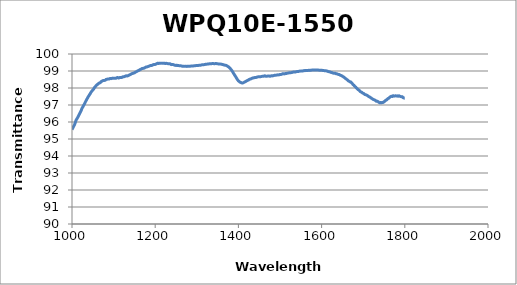
| Category | WPQ10E-1550 Transmittance |
|---|---|
| 1800.0 | 97.417 |
| 1798.0 | 97.413 |
| 1796.0 | 97.435 |
| 1794.0 | 97.488 |
| 1792.0 | 97.485 |
| 1790.0 | 97.501 |
| 1788.0 | 97.517 |
| 1786.0 | 97.541 |
| 1784.0 | 97.513 |
| 1782.0 | 97.539 |
| 1780.0 | 97.524 |
| 1778.0 | 97.544 |
| 1776.0 | 97.532 |
| 1774.0 | 97.521 |
| 1772.0 | 97.55 |
| 1770.0 | 97.498 |
| 1768.0 | 97.514 |
| 1766.0 | 97.498 |
| 1764.0 | 97.456 |
| 1762.0 | 97.406 |
| 1760.0 | 97.388 |
| 1758.0 | 97.336 |
| 1756.0 | 97.294 |
| 1754.0 | 97.279 |
| 1752.0 | 97.222 |
| 1750.0 | 97.194 |
| 1748.0 | 97.15 |
| 1746.0 | 97.155 |
| 1744.0 | 97.129 |
| 1742.0 | 97.146 |
| 1740.0 | 97.129 |
| 1738.0 | 97.155 |
| 1736.0 | 97.19 |
| 1734.0 | 97.222 |
| 1732.0 | 97.214 |
| 1730.0 | 97.26 |
| 1728.0 | 97.284 |
| 1726.0 | 97.309 |
| 1724.0 | 97.328 |
| 1722.0 | 97.362 |
| 1720.0 | 97.396 |
| 1718.0 | 97.43 |
| 1716.0 | 97.466 |
| 1714.0 | 97.485 |
| 1712.0 | 97.519 |
| 1710.0 | 97.557 |
| 1708.0 | 97.588 |
| 1706.0 | 97.601 |
| 1704.0 | 97.618 |
| 1702.0 | 97.664 |
| 1700.0 | 97.685 |
| 1698.0 | 97.713 |
| 1696.0 | 97.756 |
| 1694.0 | 97.776 |
| 1692.0 | 97.818 |
| 1690.0 | 97.875 |
| 1688.0 | 97.902 |
| 1686.0 | 97.944 |
| 1684.0 | 98 |
| 1682.0 | 98.054 |
| 1680.0 | 98.088 |
| 1678.0 | 98.153 |
| 1676.0 | 98.192 |
| 1674.0 | 98.25 |
| 1672.0 | 98.299 |
| 1670.0 | 98.356 |
| 1668.0 | 98.361 |
| 1666.0 | 98.404 |
| 1664.0 | 98.426 |
| 1662.0 | 98.474 |
| 1660.0 | 98.514 |
| 1658.0 | 98.548 |
| 1656.0 | 98.588 |
| 1654.0 | 98.632 |
| 1652.0 | 98.659 |
| 1650.0 | 98.697 |
| 1648.0 | 98.725 |
| 1646.0 | 98.741 |
| 1644.0 | 98.767 |
| 1642.0 | 98.794 |
| 1640.0 | 98.8 |
| 1638.0 | 98.822 |
| 1636.0 | 98.839 |
| 1634.0 | 98.846 |
| 1632.0 | 98.874 |
| 1630.0 | 98.871 |
| 1628.0 | 98.875 |
| 1626.0 | 98.898 |
| 1624.0 | 98.91 |
| 1622.0 | 98.924 |
| 1620.0 | 98.948 |
| 1618.0 | 98.96 |
| 1616.0 | 98.966 |
| 1614.0 | 98.989 |
| 1612.0 | 99.001 |
| 1610.0 | 99.014 |
| 1608.0 | 99.015 |
| 1606.0 | 99.021 |
| 1604.0 | 99.03 |
| 1602.0 | 99.036 |
| 1600.0 | 99.045 |
| 1598.0 | 99.047 |
| 1596.0 | 99.043 |
| 1594.0 | 99.045 |
| 1592.0 | 99.055 |
| 1590.0 | 99.057 |
| 1588.0 | 99.063 |
| 1586.0 | 99.061 |
| 1584.0 | 99.056 |
| 1582.0 | 99.058 |
| 1580.0 | 99.065 |
| 1578.0 | 99.055 |
| 1576.0 | 99.052 |
| 1574.0 | 99.045 |
| 1572.0 | 99.035 |
| 1570.0 | 99.042 |
| 1568.0 | 99.035 |
| 1566.0 | 99.031 |
| 1564.0 | 99.032 |
| 1562.0 | 99.032 |
| 1560.0 | 99.019 |
| 1558.0 | 99.026 |
| 1556.0 | 99.012 |
| 1554.0 | 99.001 |
| 1552.0 | 98.995 |
| 1550.0 | 98.992 |
| 1548.0 | 98.995 |
| 1546.0 | 98.987 |
| 1544.0 | 98.971 |
| 1542.0 | 98.966 |
| 1540.0 | 98.963 |
| 1538.0 | 98.949 |
| 1536.0 | 98.94 |
| 1534.0 | 98.942 |
| 1532.0 | 98.934 |
| 1530.0 | 98.927 |
| 1528.0 | 98.909 |
| 1526.0 | 98.901 |
| 1524.0 | 98.897 |
| 1522.0 | 98.894 |
| 1520.0 | 98.878 |
| 1518.0 | 98.872 |
| 1516.0 | 98.857 |
| 1514.0 | 98.855 |
| 1512.0 | 98.842 |
| 1510.0 | 98.827 |
| 1508.0 | 98.843 |
| 1506.0 | 98.837 |
| 1504.0 | 98.806 |
| 1502.0 | 98.798 |
| 1500.0 | 98.797 |
| 1498.0 | 98.776 |
| 1496.0 | 98.772 |
| 1494.0 | 98.772 |
| 1492.0 | 98.761 |
| 1490.0 | 98.754 |
| 1488.0 | 98.751 |
| 1486.0 | 98.741 |
| 1484.0 | 98.723 |
| 1482.0 | 98.711 |
| 1480.0 | 98.727 |
| 1478.0 | 98.703 |
| 1476.0 | 98.69 |
| 1474.0 | 98.704 |
| 1472.0 | 98.704 |
| 1470.0 | 98.7 |
| 1468.0 | 98.693 |
| 1466.0 | 98.692 |
| 1464.0 | 98.715 |
| 1462.0 | 98.708 |
| 1460.0 | 98.686 |
| 1458.0 | 98.688 |
| 1456.0 | 98.682 |
| 1454.0 | 98.668 |
| 1452.0 | 98.663 |
| 1450.0 | 98.667 |
| 1448.0 | 98.658 |
| 1446.0 | 98.649 |
| 1444.0 | 98.632 |
| 1442.0 | 98.62 |
| 1440.0 | 98.62 |
| 1438.0 | 98.606 |
| 1436.0 | 98.593 |
| 1434.0 | 98.585 |
| 1432.0 | 98.564 |
| 1430.0 | 98.535 |
| 1428.0 | 98.524 |
| 1426.0 | 98.504 |
| 1424.0 | 98.466 |
| 1422.0 | 98.447 |
| 1420.0 | 98.42 |
| 1418.0 | 98.39 |
| 1416.0 | 98.366 |
| 1414.0 | 98.339 |
| 1412.0 | 98.313 |
| 1410.0 | 98.293 |
| 1408.0 | 98.3 |
| 1406.0 | 98.321 |
| 1404.0 | 98.343 |
| 1402.0 | 98.382 |
| 1400.0 | 98.424 |
| 1398.0 | 98.481 |
| 1396.0 | 98.561 |
| 1394.0 | 98.645 |
| 1392.0 | 98.72 |
| 1390.0 | 98.795 |
| 1388.0 | 98.874 |
| 1386.0 | 98.959 |
| 1384.0 | 99.034 |
| 1382.0 | 99.098 |
| 1380.0 | 99.16 |
| 1378.0 | 99.209 |
| 1376.0 | 99.249 |
| 1374.0 | 99.279 |
| 1372.0 | 99.31 |
| 1370.0 | 99.331 |
| 1368.0 | 99.341 |
| 1366.0 | 99.353 |
| 1364.0 | 99.368 |
| 1362.0 | 99.38 |
| 1360.0 | 99.393 |
| 1358.0 | 99.406 |
| 1356.0 | 99.404 |
| 1354.0 | 99.41 |
| 1352.0 | 99.416 |
| 1350.0 | 99.423 |
| 1348.0 | 99.432 |
| 1346.0 | 99.441 |
| 1344.0 | 99.434 |
| 1342.0 | 99.425 |
| 1340.0 | 99.436 |
| 1338.0 | 99.441 |
| 1336.0 | 99.433 |
| 1334.0 | 99.426 |
| 1332.0 | 99.428 |
| 1330.0 | 99.423 |
| 1328.0 | 99.409 |
| 1326.0 | 99.409 |
| 1324.0 | 99.402 |
| 1322.0 | 99.402 |
| 1320.0 | 99.385 |
| 1318.0 | 99.376 |
| 1316.0 | 99.365 |
| 1314.0 | 99.369 |
| 1312.0 | 99.363 |
| 1310.0 | 99.346 |
| 1308.0 | 99.343 |
| 1306.0 | 99.343 |
| 1304.0 | 99.328 |
| 1302.0 | 99.32 |
| 1300.0 | 99.325 |
| 1298.0 | 99.321 |
| 1296.0 | 99.31 |
| 1294.0 | 99.309 |
| 1292.0 | 99.301 |
| 1290.0 | 99.296 |
| 1288.0 | 99.296 |
| 1286.0 | 99.289 |
| 1284.0 | 99.281 |
| 1282.0 | 99.277 |
| 1280.0 | 99.276 |
| 1278.0 | 99.275 |
| 1276.0 | 99.271 |
| 1274.0 | 99.281 |
| 1272.0 | 99.274 |
| 1270.0 | 99.273 |
| 1268.0 | 99.283 |
| 1266.0 | 99.276 |
| 1264.0 | 99.29 |
| 1262.0 | 99.302 |
| 1260.0 | 99.305 |
| 1258.0 | 99.312 |
| 1256.0 | 99.318 |
| 1254.0 | 99.318 |
| 1252.0 | 99.337 |
| 1250.0 | 99.328 |
| 1248.0 | 99.335 |
| 1246.0 | 99.35 |
| 1244.0 | 99.372 |
| 1242.0 | 99.383 |
| 1240.0 | 99.374 |
| 1238.0 | 99.385 |
| 1236.0 | 99.423 |
| 1234.0 | 99.43 |
| 1232.0 | 99.429 |
| 1230.0 | 99.434 |
| 1228.0 | 99.446 |
| 1226.0 | 99.451 |
| 1224.0 | 99.443 |
| 1222.0 | 99.455 |
| 1220.0 | 99.453 |
| 1218.0 | 99.451 |
| 1216.0 | 99.463 |
| 1214.0 | 99.462 |
| 1212.0 | 99.456 |
| 1210.0 | 99.453 |
| 1208.0 | 99.444 |
| 1206.0 | 99.455 |
| 1204.0 | 99.436 |
| 1202.0 | 99.41 |
| 1200.0 | 99.387 |
| 1198.0 | 99.388 |
| 1196.0 | 99.377 |
| 1194.0 | 99.357 |
| 1192.0 | 99.326 |
| 1190.0 | 99.324 |
| 1188.0 | 99.316 |
| 1186.0 | 99.294 |
| 1184.0 | 99.275 |
| 1182.0 | 99.259 |
| 1180.0 | 99.238 |
| 1178.0 | 99.233 |
| 1176.0 | 99.204 |
| 1174.0 | 99.178 |
| 1172.0 | 99.162 |
| 1170.0 | 99.15 |
| 1168.0 | 99.143 |
| 1166.0 | 99.106 |
| 1164.0 | 99.089 |
| 1162.0 | 99.054 |
| 1160.0 | 99.028 |
| 1158.0 | 99.01 |
| 1156.0 | 98.975 |
| 1154.0 | 98.951 |
| 1152.0 | 98.926 |
| 1150.0 | 98.889 |
| 1148.0 | 98.882 |
| 1146.0 | 98.856 |
| 1144.0 | 98.847 |
| 1142.0 | 98.816 |
| 1140.0 | 98.79 |
| 1138.0 | 98.766 |
| 1136.0 | 98.741 |
| 1134.0 | 98.714 |
| 1132.0 | 98.706 |
| 1130.0 | 98.718 |
| 1128.0 | 98.698 |
| 1126.0 | 98.669 |
| 1124.0 | 98.665 |
| 1122.0 | 98.656 |
| 1120.0 | 98.622 |
| 1118.0 | 98.62 |
| 1116.0 | 98.624 |
| 1114.0 | 98.605 |
| 1112.0 | 98.586 |
| 1110.0 | 98.613 |
| 1108.0 | 98.609 |
| 1106.0 | 98.576 |
| 1104.0 | 98.575 |
| 1102.0 | 98.567 |
| 1100.0 | 98.574 |
| 1098.0 | 98.581 |
| 1096.0 | 98.565 |
| 1094.0 | 98.551 |
| 1092.0 | 98.565 |
| 1090.0 | 98.537 |
| 1088.0 | 98.524 |
| 1086.0 | 98.527 |
| 1084.0 | 98.512 |
| 1082.0 | 98.504 |
| 1080.0 | 98.457 |
| 1078.0 | 98.447 |
| 1076.0 | 98.437 |
| 1074.0 | 98.433 |
| 1072.0 | 98.395 |
| 1070.0 | 98.377 |
| 1068.0 | 98.315 |
| 1066.0 | 98.297 |
| 1064.0 | 98.268 |
| 1062.0 | 98.223 |
| 1060.0 | 98.188 |
| 1058.0 | 98.145 |
| 1056.0 | 98.079 |
| 1054.0 | 98.027 |
| 1052.0 | 97.937 |
| 1050.0 | 97.885 |
| 1048.0 | 97.824 |
| 1046.0 | 97.762 |
| 1044.0 | 97.674 |
| 1042.0 | 97.601 |
| 1040.0 | 97.524 |
| 1038.0 | 97.441 |
| 1036.0 | 97.352 |
| 1034.0 | 97.263 |
| 1032.0 | 97.17 |
| 1030.0 | 97.065 |
| 1028.0 | 96.981 |
| 1026.0 | 96.884 |
| 1024.0 | 96.8 |
| 1022.0 | 96.672 |
| 1020.0 | 96.579 |
| 1018.0 | 96.476 |
| 1016.0 | 96.377 |
| 1014.0 | 96.282 |
| 1012.0 | 96.197 |
| 1010.0 | 96.115 |
| 1008.0 | 95.976 |
| 1006.0 | 95.836 |
| 1004.0 | 95.745 |
| 1002.0 | 95.648 |
| 1000.0 | 95.55 |